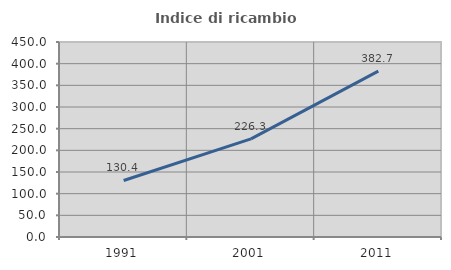
| Category | Indice di ricambio occupazionale  |
|---|---|
| 1991.0 | 130.435 |
| 2001.0 | 226.316 |
| 2011.0 | 382.692 |